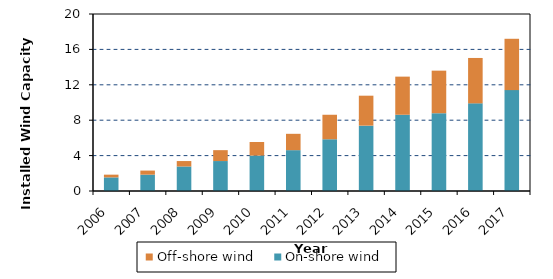
| Category | On-shore wind | Off-shore wind |
|---|---|---|
| 2006.0 | 1.538 | 0.308 |
| 2007.0 | 1.846 | 0.462 |
| 2008.0 | 2.769 | 0.615 |
| 2009.0 | 3.385 | 1.231 |
| 2010.0 | 4 | 1.538 |
| 2011.0 | 4.615 | 1.846 |
| 2012.0 | 5.846 | 2.769 |
| 2013.0 | 7.385 | 3.385 |
| 2014.0 | 8.615 | 4.308 |
| 2015.0 | 8.79 | 4.809 |
| 2016.0 | 9.903 | 5.13 |
| 2017.0 | 11.4 | 5.8 |